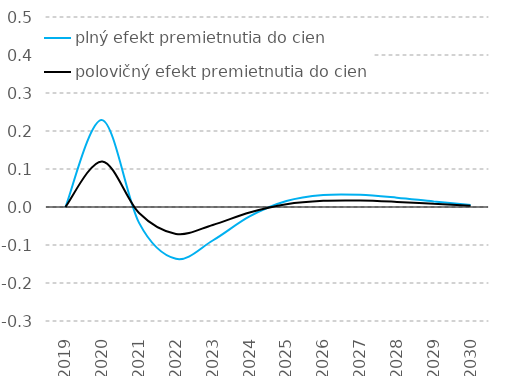
| Category | plný efekt premietnutia do cien | polovičný efekt premietnutia do cien |
|---|---|---|
| 2019.0 | 0 | 0 |
| 2020.0 | 0.229 | 0.12 |
| 2021.0 | -0.042 | -0.016 |
| 2022.0 | -0.136 | -0.071 |
| 2023.0 | -0.088 | -0.047 |
| 2024.0 | -0.025 | -0.014 |
| 2025.0 | 0.016 | 0.007 |
| 2026.0 | 0.032 | 0.016 |
| 2027.0 | 0.032 | 0.017 |
| 2028.0 | 0.025 | 0.013 |
| 2029.0 | 0.015 | 0.008 |
| 2030.0 | 0.005 | 0.004 |